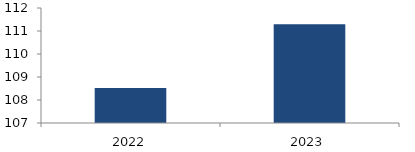
| Category | Series 0 |
|---|---|
| 2022.0 | 108.526 |
| 2023.0 | 111.297 |